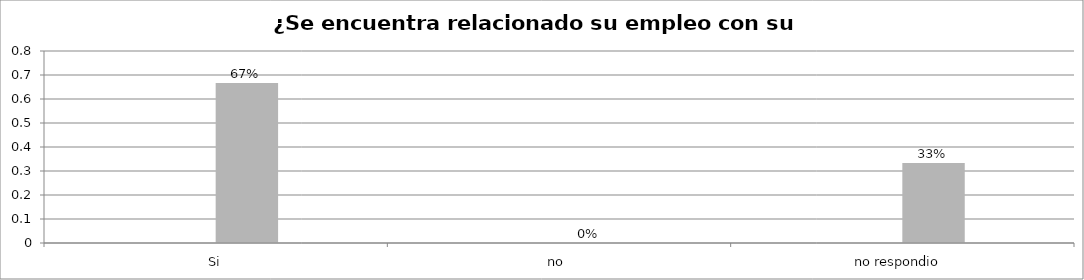
| Category | Series 0 | Series 1 | Series 2 | Series 3 |
|---|---|---|---|---|
| Si |  |  | 0.667 |  |
| no  |  |  | 0 |  |
| no respondio  |  |  | 0.333 |  |